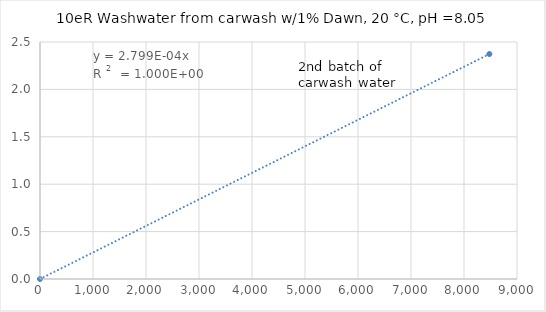
| Category | Series 0 |
|---|---|
| 0.0 | 0 |
| 8478.260869565218 | 2.373 |